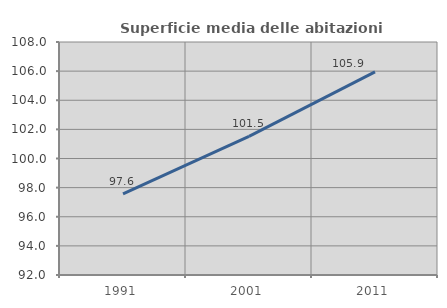
| Category | Superficie media delle abitazioni occupate |
|---|---|
| 1991.0 | 97.569 |
| 2001.0 | 101.517 |
| 2011.0 | 105.943 |